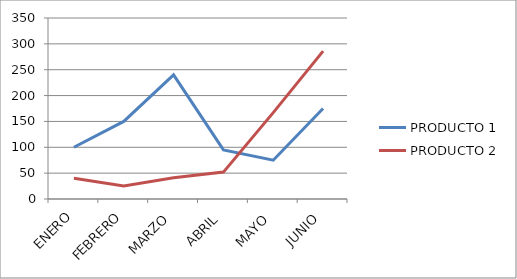
| Category | PRODUCTO 1 | PRODUCTO 2 |
|---|---|---|
| ENERO | 100 | 40 |
| FEBRERO | 150 | 25 |
| MARZO | 240 | 41 |
| ABRIL | 95 | 52 |
| MAYO | 75 | 167 |
| JUNIO | 175 | 286 |